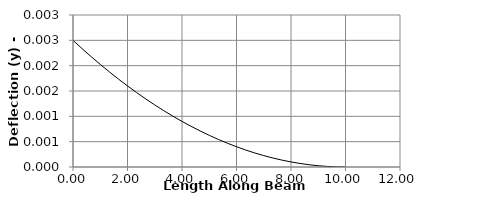
| Category | y |
|---|---|
| 0.0 | 0.002 |
| 0.3333333333333333 | 0.002 |
| 0.6666666666666666 | 0.002 |
| 1.0 | 0.002 |
| 1.3333333333333333 | 0.002 |
| 1.6666666666666665 | 0.002 |
| 2.0 | 0.002 |
| 2.333333333333333 | 0.001 |
| 2.6666666666666665 | 0.001 |
| 3.0 | 0.001 |
| 3.333333333333333 | 0.001 |
| 3.6666666666666665 | 0.001 |
| 4.0 | 0.001 |
| 4.333333333333333 | 0.001 |
| 4.666666666666666 | 0.001 |
| 5.0 | 0.001 |
| 5.333333333333333 | 0.001 |
| 5.666666666666666 | 0 |
| 6.0 | 0 |
| 6.333333333333333 | 0 |
| 6.666666666666666 | 0 |
| 7.0 | 0 |
| 7.333333333333333 | 0 |
| 7.666666666666666 | 0 |
| 8.0 | 0 |
| 8.333333333333332 | 0 |
| 8.666666666666666 | 0 |
| 9.0 | 0 |
| 9.333333333333332 | 0 |
| 9.666666666666666 | 0 |
| 10.0 | 0 |
| 10.0 | 0 |
| 10.0 | 0 |